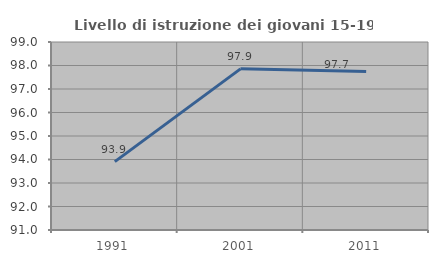
| Category | Livello di istruzione dei giovani 15-19 anni |
|---|---|
| 1991.0 | 93.911 |
| 2001.0 | 97.857 |
| 2011.0 | 97.749 |